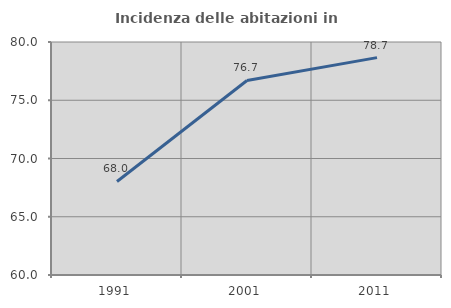
| Category | Incidenza delle abitazioni in proprietà  |
|---|---|
| 1991.0 | 68.027 |
| 2001.0 | 76.699 |
| 2011.0 | 78.658 |